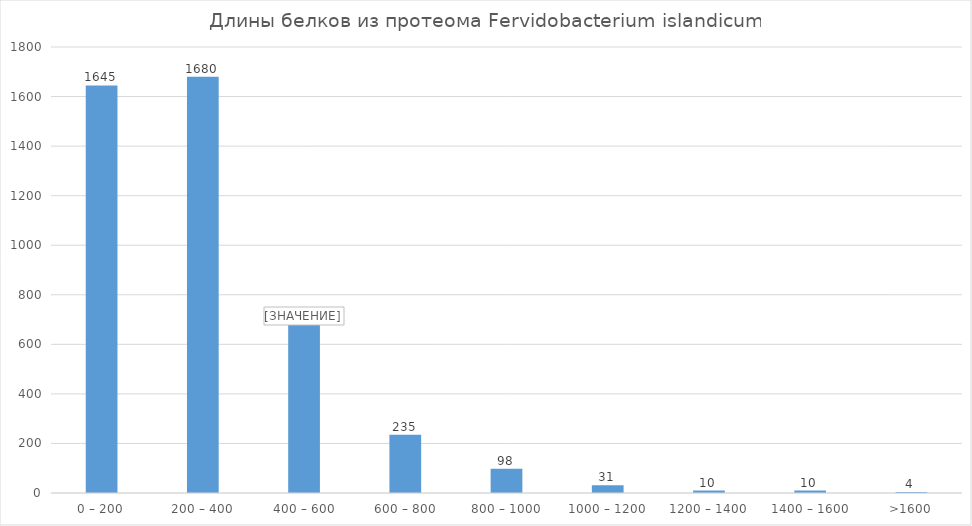
| Category | Series 0 |
|---|---|
| 0 – 200 | 1645 |
| 200 – 400 | 1680 |
| 400 – 600 | 681 |
| 600 – 800 | 235 |
| 800 – 1000 | 98 |
| 1000 – 1200 | 31 |
| 1200 – 1400 | 10 |
| 1400 – 1600 | 10 |
| >1600 | 4 |